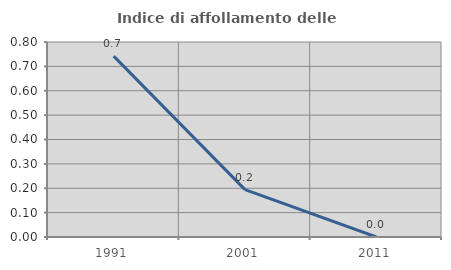
| Category | Indice di affollamento delle abitazioni  |
|---|---|
| 1991.0 | 0.742 |
| 2001.0 | 0.194 |
| 2011.0 | 0 |